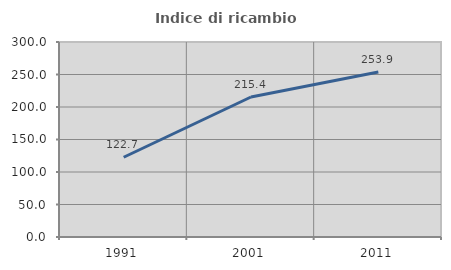
| Category | Indice di ricambio occupazionale  |
|---|---|
| 1991.0 | 122.722 |
| 2001.0 | 215.385 |
| 2011.0 | 253.889 |